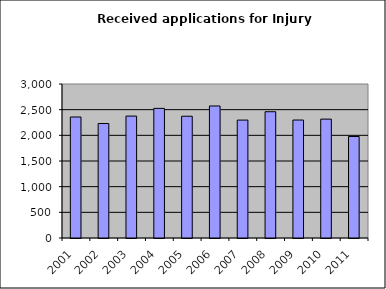
| Category | Series 1 |
|---|---|
| 2001.0 | 2357 |
| 2002.0 | 2230 |
| 2003.0 | 2375 |
| 2004.0 | 2525 |
| 2005.0 | 2372 |
| 2006.0 | 2572 |
| 2007.0 | 2297 |
| 2008.0 | 2460 |
| 2009.0 | 2298 |
| 2010.0 | 2316 |
| 2011.0 | 1977 |